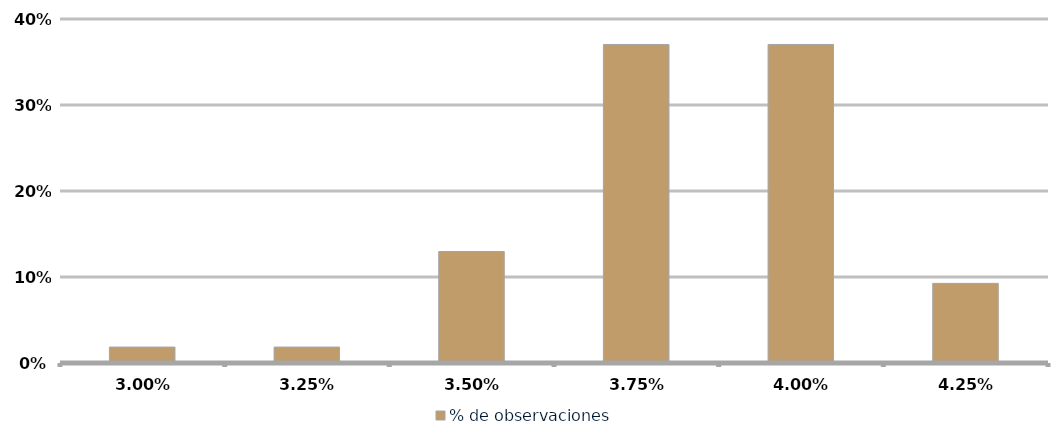
| Category | % de observaciones  |
|---|---|
| 0.029999999999999995 | 0.019 |
| 0.032499999999999994 | 0.019 |
| 0.034999999999999996 | 0.13 |
| 0.0375 | 0.37 |
| 0.04 | 0.37 |
| 0.0425 | 0.093 |